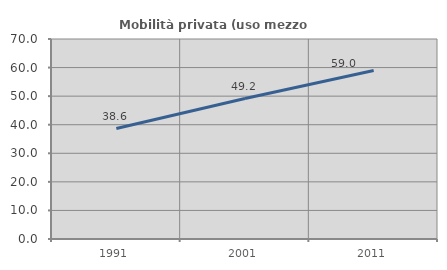
| Category | Mobilità privata (uso mezzo privato) |
|---|---|
| 1991.0 | 38.649 |
| 2001.0 | 49.156 |
| 2011.0 | 58.98 |